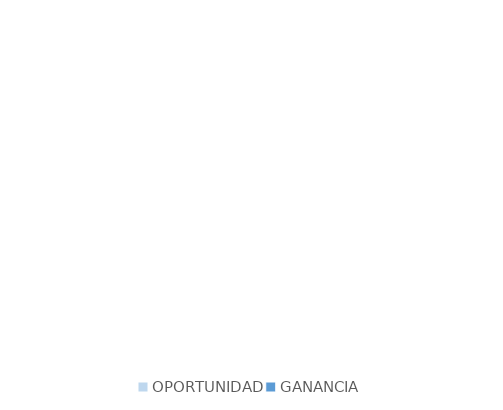
| Category | Series 0 |
|---|---|
| OPORTUNIDAD | 0 |
| GANANCIA | 0 |